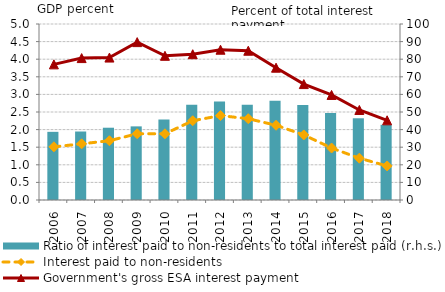
| Category | Ratio of interest paid to non-residents to total interest paid (r.h.s.) |
|---|---|
| 2006.0 | 38.734 |
| 2007.0 | 38.919 |
| 2008.0 | 41.069 |
| 2009.0 | 41.833 |
| 2010.0 | 45.737 |
| 2011.0 | 54.17 |
| 2012.0 | 56.012 |
| 2013.0 | 54.062 |
| 2014.0 | 56.448 |
| 2015.0 | 53.997 |
| 2016.0 | 49.469 |
| 2017.0 | 46.439 |
| 2018.0 | 42.709 |